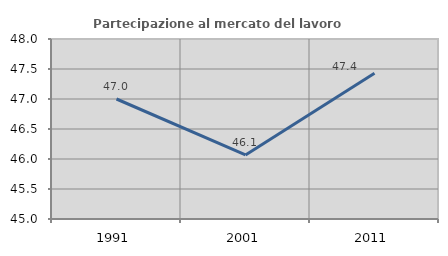
| Category | Partecipazione al mercato del lavoro  femminile |
|---|---|
| 1991.0 | 47 |
| 2001.0 | 46.067 |
| 2011.0 | 47.429 |